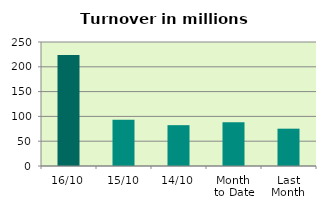
| Category | Series 0 |
|---|---|
| 16/10 | 223.823 |
| 15/10 | 93.458 |
| 14/10 | 82.333 |
| Month 
to Date | 88.197 |
| Last
Month | 75.235 |